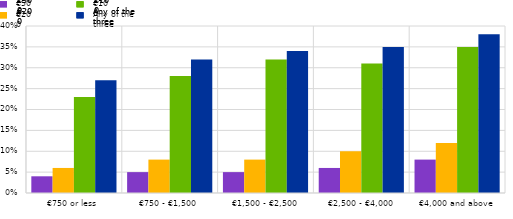
| Category | €500 | €200 | €100 | Any of the three |
|---|---|---|---|---|
| €750 or less | 0.04 | 0.06 | 0.23 | 0.27 |
| €750 - €1,500 | 0.05 | 0.08 | 0.28 | 0.32 |
| €1,500 - €2,500 | 0.05 | 0.08 | 0.32 | 0.34 |
| €2,500 - €4,000 | 0.06 | 0.1 | 0.31 | 0.35 |
| €4,000 and above | 0.08 | 0.12 | 0.35 | 0.38 |